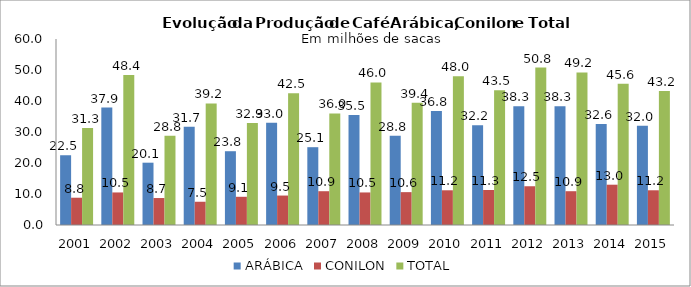
| Category | ARÁBICA | CONILON | TOTAL |
|---|---|---|---|
| 2001.0 | 22.5 | 8.8 | 31.3 |
| 2002.0 | 37.9 | 10.5 | 48.4 |
| 2003.0 | 20.1 | 8.7 | 28.8 |
| 2004.0 | 31.7 | 7.5 | 39.2 |
| 2005.0 | 23.8 | 9.1 | 32.9 |
| 2006.0 | 33 | 9.5 | 42.5 |
| 2007.0 | 25.1 | 10.9 | 36 |
| 2008.0 | 35.5 | 10.5 | 46 |
| 2009.0 | 28.8 | 10.6 | 39.4 |
| 2010.0 | 36.8 | 11.2 | 48 |
| 2011.0 | 32.2 | 11.3 | 43.5 |
| 2012.0 | 38.3 | 12.5 | 50.8 |
| 2013.0 | 38.3 | 10.9 | 49.2 |
| 2014.0 | 32.6 | 13 | 45.6 |
| 2015.0 | 32 | 11.2 | 43.2 |